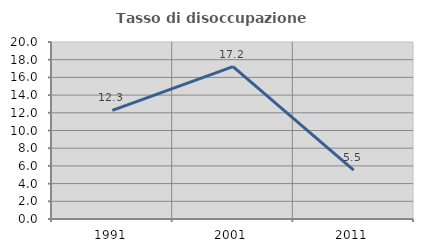
| Category | Tasso di disoccupazione giovanile  |
|---|---|
| 1991.0 | 12.268 |
| 2001.0 | 17.213 |
| 2011.0 | 5.512 |